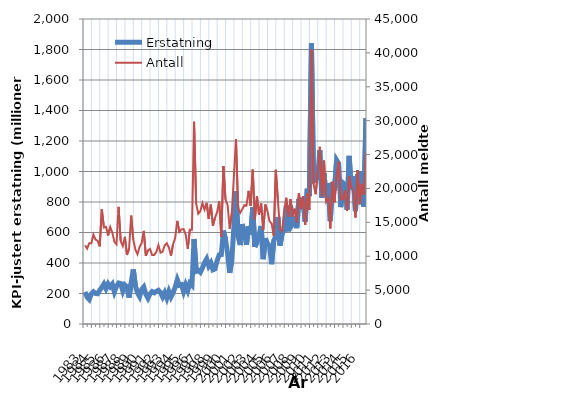
| Category | Erstatning |
|---|---|
| 1983.0 | 210.22 |
| nan | 176.092 |
| nan | 161.035 |
| nan | 197.262 |
| 1984.0 | 211.53 |
| nan | 200.092 |
| nan | 198.387 |
| nan | 221.897 |
| 1985.0 | 239.789 |
| nan | 262.097 |
| nan | 232.248 |
| nan | 263.401 |
| 1986.0 | 244.213 |
| nan | 261.318 |
| nan | 210.326 |
| nan | 246.13 |
| 1987.0 | 268.892 |
| nan | 265.347 |
| nan | 217.144 |
| nan | 255.477 |
| 1988.0 | 243.163 |
| nan | 173.337 |
| nan | 269.977 |
| nan | 357.645 |
| 1989.0 | 252.668 |
| nan | 204.216 |
| nan | 179.693 |
| nan | 226.703 |
| 1990.0 | 242.739 |
| nan | 195.284 |
| nan | 169.363 |
| nan | 197.133 |
| 1991.0 | 212.725 |
| nan | 204.534 |
| nan | 214.059 |
| nan | 221.31 |
| 1992.0 | 206.744 |
| nan | 178.142 |
| nan | 205.839 |
| nan | 169.858 |
| 1993.0 | 213.125 |
| nan | 177.367 |
| nan | 204.917 |
| nan | 242.422 |
| 1994.0 | 290.354 |
| nan | 253.835 |
| nan | 257.894 |
| nan | 212.568 |
| 1995.0 | 256.1 |
| nan | 220.322 |
| nan | 267.715 |
| nan | 254.182 |
| 1996.0 | 557.419 |
| nan | 345.163 |
| nan | 351.33 |
| nan | 338.83 |
| 1997.0 | 366.813 |
| nan | 402.515 |
| nan | 426.268 |
| nan | 380.33 |
| 1998.0 | 401.239 |
| nan | 355.459 |
| nan | 361.267 |
| nan | 415.235 |
| 1999.0 | 452.902 |
| nan | 455.102 |
| nan | 612.398 |
| nan | 554.608 |
| 2000.0 | 462.302 |
| nan | 335.733 |
| nan | 416.214 |
| nan | 634.598 |
| 2001.0 | 870.913 |
| nan | 576.547 |
| nan | 517.816 |
| nan | 655.144 |
| 2002.0 | 596.676 |
| nan | 519.166 |
| nan | 641.6 |
| nan | 584.641 |
| 2003.0 | 764.63 |
| nan | 505.546 |
| nan | 537.836 |
| nan | 585.894 |
| 2004.0 | 642.757 |
| nan | 424.948 |
| nan | 561.798 |
| nan | 525.108 |
| 2005.0 | 513.953 |
| nan | 392.217 |
| nan | 544.503 |
| nan | 577.037 |
| 2006.0 | 701.398 |
| nan | 514.379 |
| nan | 591.856 |
| nan | 617.47 |
| 2007.0 | 772.886 |
| nan | 607.651 |
| nan | 776.377 |
| nan | 656.412 |
| 2008.0 | 678.816 |
| nan | 628.412 |
| nan | 820.743 |
| nan | 788.239 |
| 2009.0 | 827.169 |
| nan | 671.529 |
| nan | 887.072 |
| nan | 838.469 |
| 2010.0 | 1839.261 |
| nan | 938.114 |
| nan | 942.627 |
| nan | 964.348 |
| 2011.0 | 1139.682 |
| nan | 828.751 |
| nan | 988.158 |
| nan | 832.784 |
| 2012.0 | 922.611 |
| nan | 674.513 |
| nan | 929.964 |
| nan | 875.649 |
| 2013.0 | 1075.389 |
| nan | 1053.009 |
| nan | 766.218 |
| nan | 925.502 |
| 2014.0 | 912.794 |
| nan | 749.584 |
| nan | 1102.677 |
| nan | 881.657 |
| 2015.0 | 967.292 |
| nan | 740.776 |
| nan | 980.576 |
| nan | 870.639 |
| 2016.0 | 1000.868 |
| nan | 770.405 |
| nan | 1351.154 |